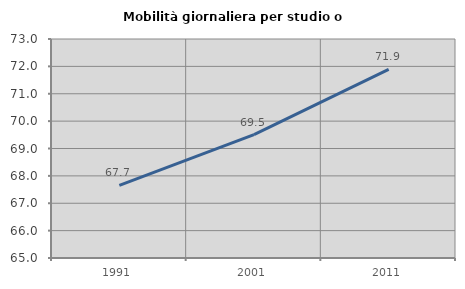
| Category | Mobilità giornaliera per studio o lavoro |
|---|---|
| 1991.0 | 67.651 |
| 2001.0 | 69.504 |
| 2011.0 | 71.892 |